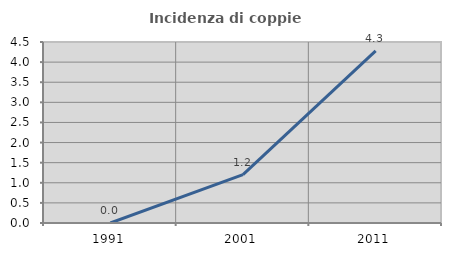
| Category | Incidenza di coppie miste |
|---|---|
| 1991.0 | 0 |
| 2001.0 | 1.205 |
| 2011.0 | 4.278 |